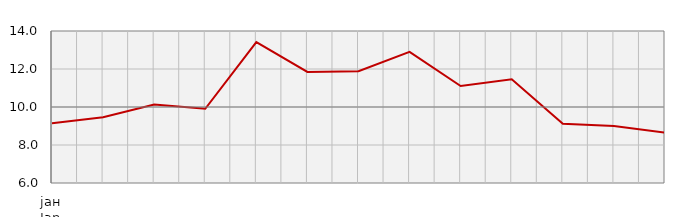
| Category | Индекси ноћења туриста
Tourist night indices |
|---|---|
| јан
Jan | 91.47 |